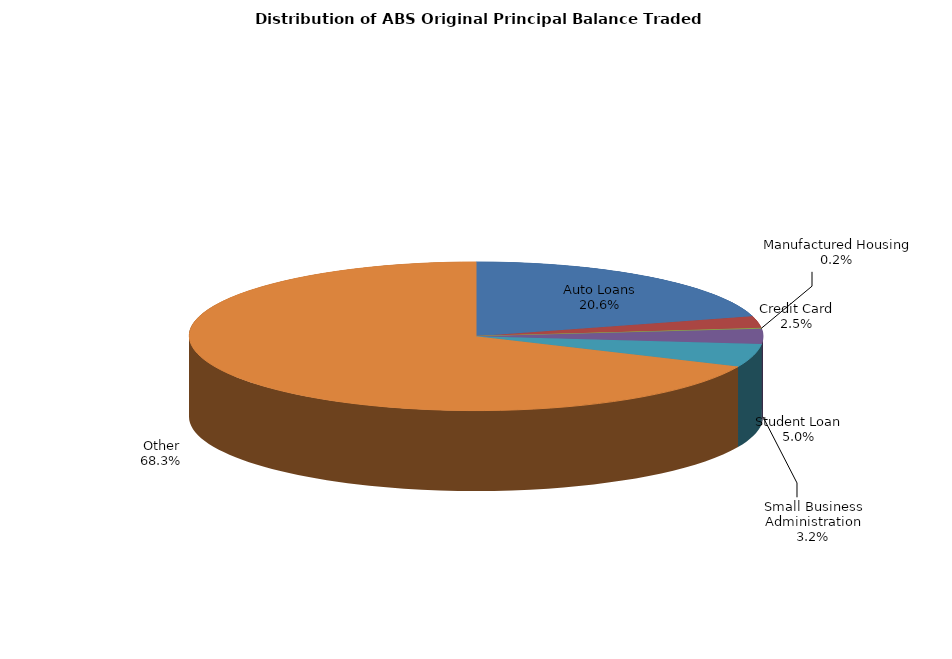
| Category | Series 0 |
|---|---|
| Auto Loans | 495549415.361 |
| Credit Card | 60918320 |
| Manufactured Housing | 5925506.836 |
| Small Business Administration | 78049683.056 |
| Student Loan | 120907104.308 |
| Other | 1641068011.371 |